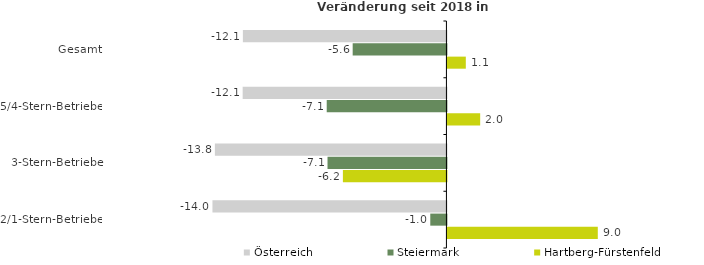
| Category | Österreich | Steiermark | Hartberg-Fürstenfeld |
|---|---|---|---|
| Gesamt | -12.137 | -5.59 | 1.096 |
| 5/4-Stern-Betriebe | -12.15 | -7.138 | 1.953 |
| 3-Stern-Betriebe | -13.805 | -7.09 | -6.173 |
| 2/1-Stern-Betriebe | -13.951 | -0.963 | 8.966 |